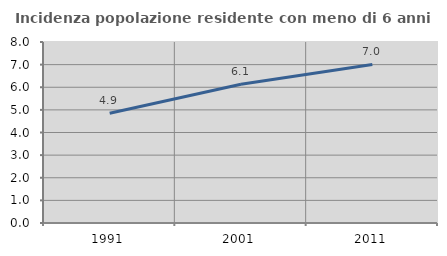
| Category | Incidenza popolazione residente con meno di 6 anni |
|---|---|
| 1991.0 | 4.851 |
| 2001.0 | 6.129 |
| 2011.0 | 7.007 |